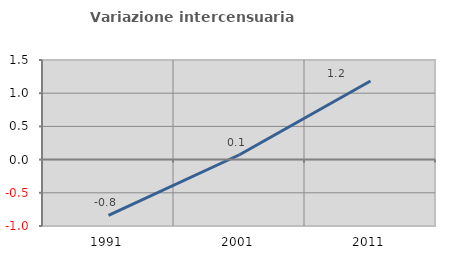
| Category | Variazione intercensuaria annua |
|---|---|
| 1991.0 | -0.838 |
| 2001.0 | 0.073 |
| 2011.0 | 1.184 |